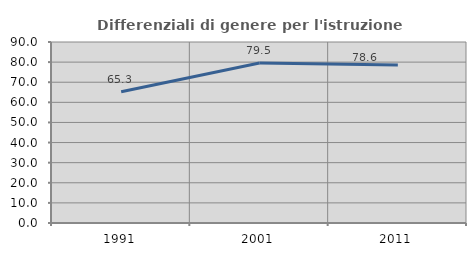
| Category | Differenziali di genere per l'istruzione superiore |
|---|---|
| 1991.0 | 65.257 |
| 2001.0 | 79.54 |
| 2011.0 | 78.62 |